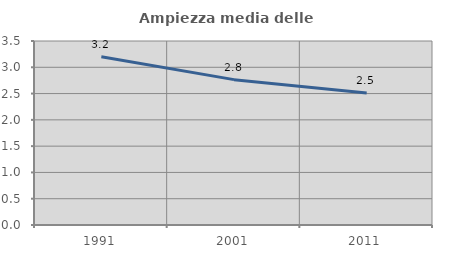
| Category | Ampiezza media delle famiglie |
|---|---|
| 1991.0 | 3.2 |
| 2001.0 | 2.765 |
| 2011.0 | 2.51 |